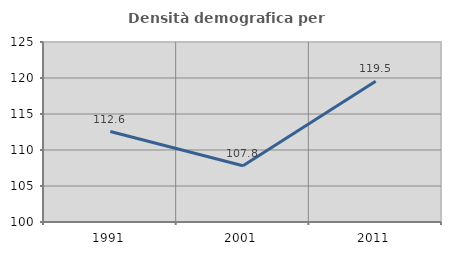
| Category | Densità demografica |
|---|---|
| 1991.0 | 112.562 |
| 2001.0 | 107.811 |
| 2011.0 | 119.534 |